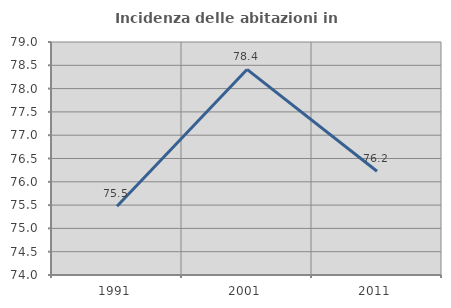
| Category | Incidenza delle abitazioni in proprietà  |
|---|---|
| 1991.0 | 75.474 |
| 2001.0 | 78.411 |
| 2011.0 | 76.227 |